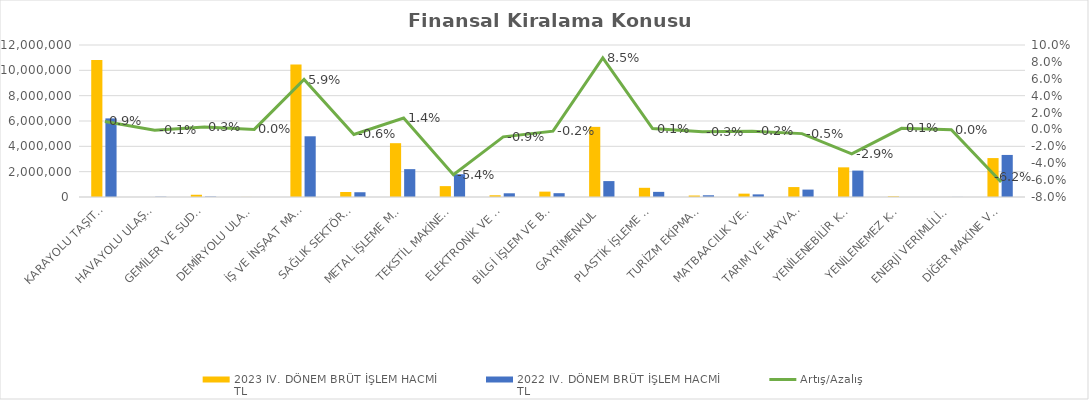
| Category | 2023 IV. DÖNEM BRÜT İŞLEM HACMİ 
TL | 2022 IV. DÖNEM BRÜT İŞLEM HACMİ 
TL |
|---|---|---|
| KARAYOLU TAŞITLARI | 10820476.45 | 6205507.536 |
| HAVAYOLU ULAŞIM ARAÇLARI | 0 | 22149 |
| GEMİLER VE SUDA YÜZEN TAŞIT VE ARAÇLAR | 176867.155 | 32156 |
| DEMİRYOLU ULAŞIM ARAÇLARI | 4630.25 | 2337 |
| İŞ VE İNŞAAT MAKİNELERİ | 10451455.047 | 4792789.163 |
| SAĞLIK SEKTÖRÜ VE ESTETİK EKİPMANLARI | 393770.18 | 375571.826 |
| METAL İŞLEME MAKİNELERİ | 4248400.276 | 2199682.716 |
| TEKSTİL MAKİNELERİ | 858855.746 | 1799477.464 |
| ELEKTRONİK VE OPTİK CİHAZLAR | 137680.744 | 293173.535 |
| BİLGİ İŞLEM VE BÜRO SİSTEMLERİ | 423792.672 | 300661.237 |
| GAYRİMENKUL | 5536910.937 | 1255803.29 |
| PLASTİK İŞLEME MAKİNELERİ | 725695.531 | 405529.236 |
| TURİZM EKİPMANLARI | 116417.439 | 136315.941 |
| MATBAACILIK VE KAĞIT İŞLEME MAKİNELERİ | 264857.711 | 207078.963 |
| TARIM VE HAYVANCILIK MAKİNELERİ | 784513.201 | 584922.906 |
| YENİLENEBİLİR KAYNAKLI ELEKTRİK ENERJİSİ ÜRETİM EKİPMANLARI | 2341629.444 | 2084702.188 |
| YENİLENEMEZ KAYNAKLI ELEKTRİK ENERJİSİ ÜRETİM EKİPMANLARI | 51740 | 0 |
| ENERJİ VERİMLİLİĞİ EKİPMANLARI | 0 | 5470 |
| DİĞER MAKİNE VE EKİPMANLAR | 3072852.335 | 3320587.501 |